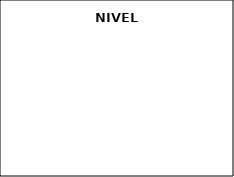
| Category | Series 0 |
|---|---|
| Preescolar | 0 |
| Básica primaria | 0 |
| Básica secundaria | 0 |
| Media | 0 |
| Técnico | 0 |
| Tecnólogo | 0 |
| Superior | 0 |